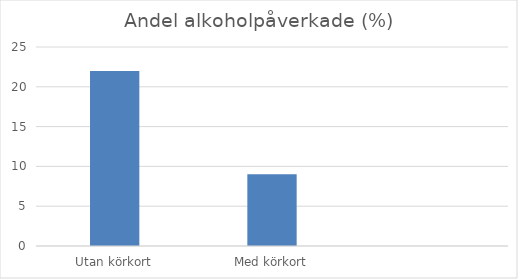
| Category | Andel % |
|---|---|
| Utan körkort | 22 |
| Med körkort | 9 |